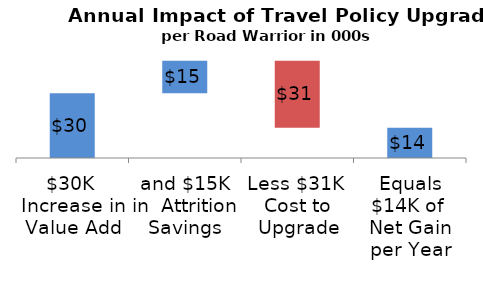
| Category | Series 0 | Series 1 |
|---|---|---|
| $30K  Increase in Value Add | 0 | 30 |
| and $15K in  Attrition Savings | 30 | 15 |
| Less $31K  Cost to Upgrade | 14 | 31 |
| Equals $14K of  Net Gain per Year | 0 | 14 |